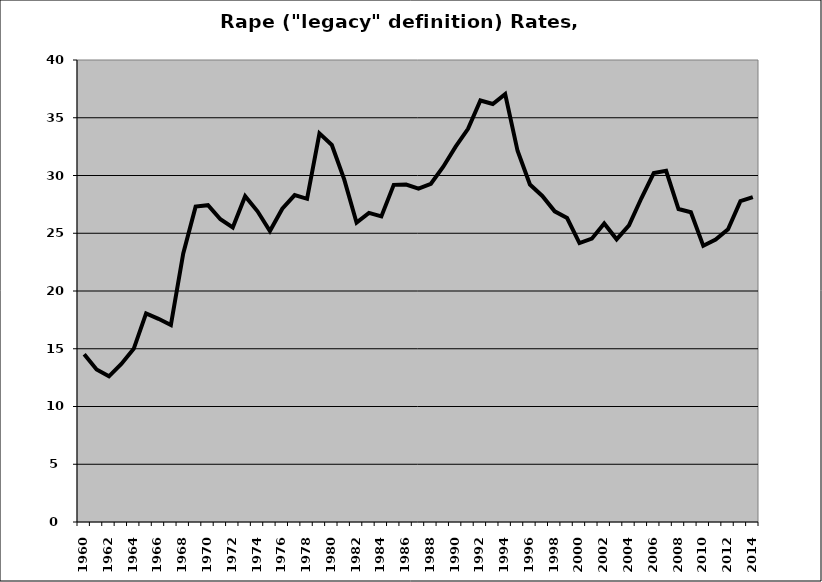
| Category | Rape |
|---|---|
| 1960.0 | 14.515 |
| 1961.0 | 13.202 |
| 1962.0 | 12.609 |
| 1963.0 | 13.678 |
| 1964.0 | 14.992 |
| 1965.0 | 18.056 |
| 1966.0 | 17.591 |
| 1967.0 | 17.054 |
| 1968.0 | 23.255 |
| 1969.0 | 27.306 |
| 1970.0 | 27.43 |
| 1971.0 | 26.216 |
| 1972.0 | 25.5 |
| 1973.0 | 28.211 |
| 1974.0 | 26.9 |
| 1975.0 | 25.194 |
| 1976.0 | 27.124 |
| 1977.0 | 28.307 |
| 1978.0 | 27.984 |
| 1979.0 | 33.648 |
| 1980.0 | 32.644 |
| 1981.0 | 29.668 |
| 1982.0 | 25.914 |
| 1983.0 | 26.761 |
| 1984.0 | 26.458 |
| 1985.0 | 29.191 |
| 1986.0 | 29.214 |
| 1987.0 | 28.865 |
| 1988.0 | 29.286 |
| 1989.0 | 30.762 |
| 1990.0 | 32.499 |
| 1991.0 | 34.044 |
| 1992.0 | 36.491 |
| 1993.0 | 36.186 |
| 1994.0 | 37.041 |
| 1995.0 | 32.137 |
| 1996.0 | 29.222 |
| 1997.0 | 28.23 |
| 1998.0 | 26.898 |
| 1999.0 | 26.315 |
| 2000.0 | 24.146 |
| 2001.0 | 24.533 |
| 2002.0 | 25.84 |
| 2003.0 | 24.479 |
| 2004.0 | 25.679 |
| 2005.0 | 28.028 |
| 2006.0 | 30.209 |
| 2007.0 | 30.399 |
| 2008.0 | 27.097 |
| 2009.0 | 26.822 |
| 2010.0 | 23.911 |
| 2011.0 | 24.447 |
| 2012.0 | 25.346 |
| 2013.0 | 27.775 |
| 2014.0 | 28.135 |